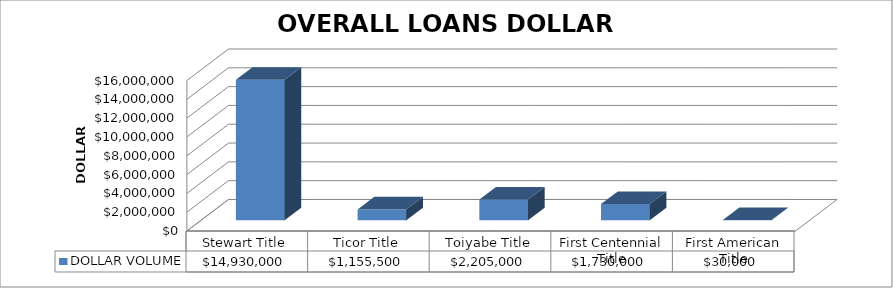
| Category | DOLLAR VOLUME |
|---|---|
| Stewart Title | 14930000 |
| Ticor Title | 1155500 |
| Toiyabe Title | 2205000 |
| First Centennial Title | 1730000 |
| First American Title | 30000 |